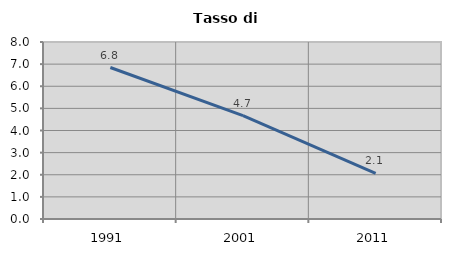
| Category | Tasso di disoccupazione   |
|---|---|
| 1991.0 | 6.847 |
| 2001.0 | 4.67 |
| 2011.0 | 2.057 |